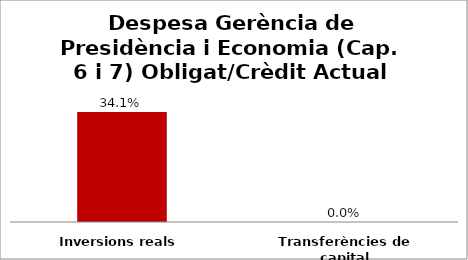
| Category | Series 0 |
|---|---|
| Inversions reals | 0.341 |
| Transferències de capital | 0 |